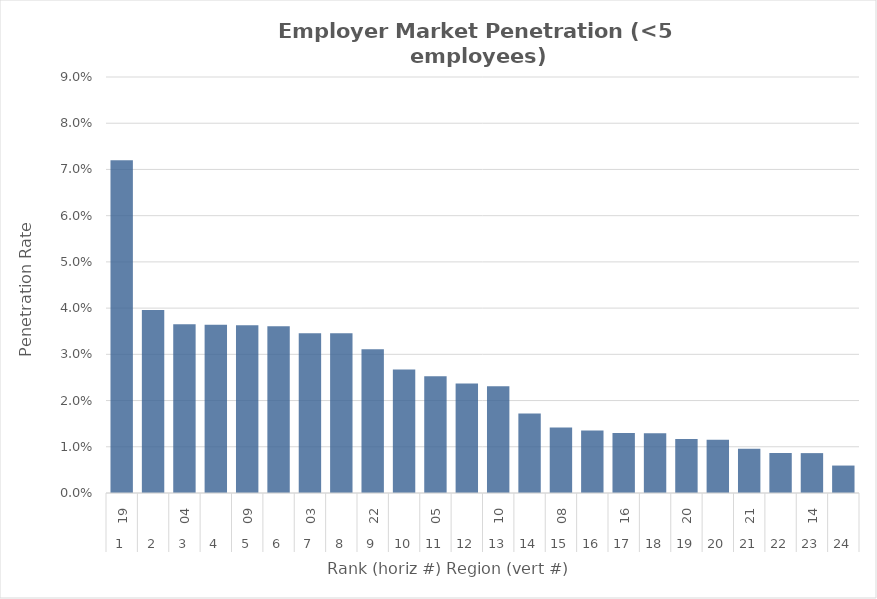
| Category | Rate |
|---|---|
| 0 | 0.072 |
| 1 | 0.04 |
| 2 | 0.036 |
| 3 | 0.036 |
| 4 | 0.036 |
| 5 | 0.036 |
| 6 | 0.035 |
| 7 | 0.035 |
| 8 | 0.031 |
| 9 | 0.027 |
| 10 | 0.025 |
| 11 | 0.024 |
| 12 | 0.023 |
| 13 | 0.017 |
| 14 | 0.014 |
| 15 | 0.014 |
| 16 | 0.013 |
| 17 | 0.013 |
| 18 | 0.012 |
| 19 | 0.011 |
| 20 | 0.01 |
| 21 | 0.009 |
| 22 | 0.009 |
| 23 | 0.006 |